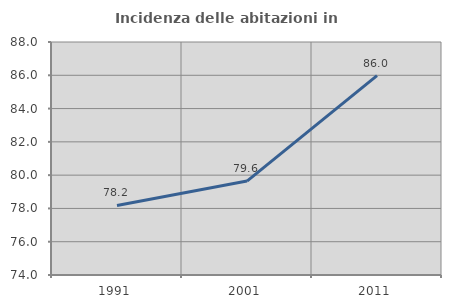
| Category | Incidenza delle abitazioni in proprietà  |
|---|---|
| 1991.0 | 78.178 |
| 2001.0 | 79.646 |
| 2011.0 | 85.976 |